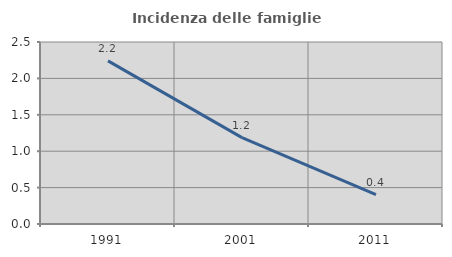
| Category | Incidenza delle famiglie numerose |
|---|---|
| 1991.0 | 2.24 |
| 2001.0 | 1.187 |
| 2011.0 | 0.402 |